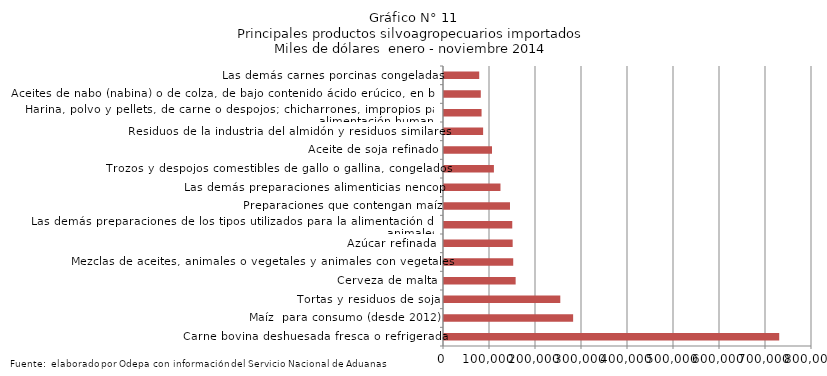
| Category | Series 0 |
|---|---|
| Carne bovina deshuesada fresca o refrigerada | 728729.925 |
| Maíz  para consumo (desde 2012) | 280720.362 |
| Tortas y residuos de soja | 252810.733 |
| Cerveza de malta | 155747.509 |
| Mezclas de aceites, animales o vegetales y animales con vegetales | 150480.779 |
| Azúcar refinada | 149254.667 |
| Las demás preparaciones de los tipos utilizados para la alimentación de los animales | 148411.595 |
| Preparaciones que contengan maíz | 143467.666 |
| Las demás preparaciones alimenticias nencop | 122761.994 |
| Trozos y despojos comestibles de gallo o gallina, congelados | 108491.221 |
| Aceite de soja refinado | 104363.787 |
| Residuos de la industria del almidón y residuos similares | 85038.384 |
| Harina, polvo y pellets, de carne o despojos; chicharrones, impropios para la alimentación humana | 81670.572 |
| Aceites de nabo (nabina) o de colza, de bajo contenido ácido erúcico, en bruto | 79981 |
| Las demás carnes porcinas congeladas | 76560.25 |